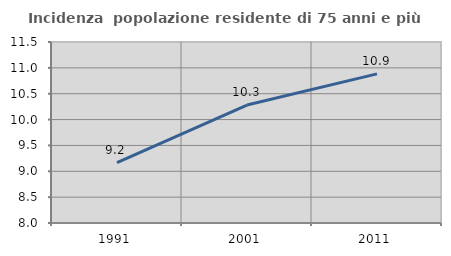
| Category | Incidenza  popolazione residente di 75 anni e più |
|---|---|
| 1991.0 | 9.167 |
| 2001.0 | 10.28 |
| 2011.0 | 10.883 |